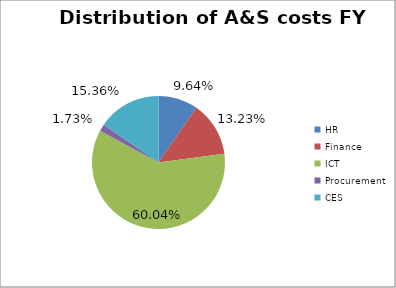
| Category | Distribution of A&S costs FY 2014/15 |
|---|---|
| HR | 0.096 |
| Finance | 0.132 |
| ICT | 0.6 |
| Procurement | 0.017 |
| CES | 0.154 |